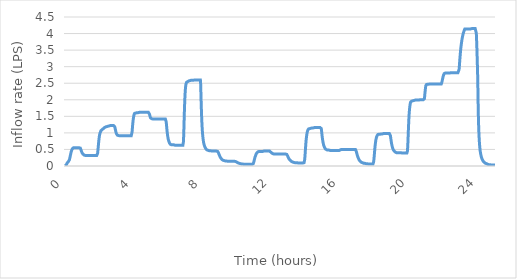
| Category | (LPS)            |
|---|---|
| 0.0 | 0.01 |
| 0.016666666666666666 | 0.01 |
| 0.03333333333333333 | 0.02 |
| 0.05 | 0.03 |
| 0.06666666666666667 | 0.04 |
| 0.08333333333333333 | 0.05 |
| 0.09999999999999999 | 0.07 |
| 0.11666666666666665 | 0.09 |
| 0.13333333333333333 | 0.11 |
| 0.15 | 0.12 |
| 0.16666666666666666 | 0.12 |
| 0.18333333333333332 | 0.13 |
| 0.19999999999999998 | 0.13 |
| 0.21666666666666665 | 0.14 |
| 0.2333333333333333 | 0.16 |
| 0.24999999999999997 | 0.19 |
| 0.26666666666666666 | 0.22 |
| 0.2833333333333333 | 0.27 |
| 0.3 | 0.31 |
| 0.31666666666666665 | 0.35 |
| 0.3333333333333333 | 0.39 |
| 0.35 | 0.43 |
| 0.36666666666666664 | 0.46 |
| 0.3833333333333333 | 0.48 |
| 0.39999999999999997 | 0.5 |
| 0.41666666666666663 | 0.52 |
| 0.4333333333333333 | 0.53 |
| 0.44999999999999996 | 0.54 |
| 0.4666666666666666 | 0.55 |
| 0.4833333333333333 | 0.55 |
| 0.49999999999999994 | 0.55 |
| 0.5166666666666666 | 0.55 |
| 0.5333333333333333 | 0.55 |
| 0.55 | 0.55 |
| 0.5666666666666668 | 0.55 |
| 0.5833333333333335 | 0.55 |
| 0.6000000000000002 | 0.55 |
| 0.6166666666666669 | 0.55 |
| 0.6333333333333336 | 0.55 |
| 0.6500000000000004 | 0.55 |
| 0.6666666666666671 | 0.55 |
| 0.6833333333333338 | 0.55 |
| 0.7000000000000005 | 0.55 |
| 0.7166666666666672 | 0.55 |
| 0.733333333333334 | 0.55 |
| 0.7500000000000007 | 0.55 |
| 0.7666666666666674 | 0.55 |
| 0.7833333333333341 | 0.55 |
| 0.8000000000000008 | 0.55 |
| 0.8166666666666675 | 0.55 |
| 0.8333333333333343 | 0.55 |
| 0.850000000000001 | 0.56 |
| 0.8666666666666677 | 0.55 |
| 0.8833333333333344 | 0.54 |
| 0.9000000000000011 | 0.51 |
| 0.9166666666666679 | 0.49 |
| 0.9333333333333346 | 0.46 |
| 0.9500000000000013 | 0.44 |
| 0.966666666666668 | 0.42 |
| 0.9833333333333347 | 0.4 |
| 1.0000000000000013 | 0.39 |
| 1.016666666666668 | 0.37 |
| 1.0333333333333345 | 0.36 |
| 1.0500000000000012 | 0.35 |
| 1.0666666666666678 | 0.34 |
| 1.0833333333333344 | 0.34 |
| 1.100000000000001 | 0.33 |
| 1.1166666666666676 | 0.33 |
| 1.1333333333333342 | 0.32 |
| 1.1500000000000008 | 0.32 |
| 1.1666666666666674 | 0.32 |
| 1.183333333333334 | 0.32 |
| 1.2000000000000006 | 0.32 |
| 1.2166666666666672 | 0.32 |
| 1.2333333333333338 | 0.32 |
| 1.2500000000000004 | 0.32 |
| 1.266666666666667 | 0.32 |
| 1.2833333333333337 | 0.32 |
| 1.3000000000000003 | 0.32 |
| 1.3166666666666669 | 0.32 |
| 1.3333333333333335 | 0.32 |
| 1.35 | 0.32 |
| 1.3666666666666667 | 0.32 |
| 1.3833333333333333 | 0.32 |
| 1.4 | 0.32 |
| 1.4166666666666665 | 0.32 |
| 1.4333333333333331 | 0.32 |
| 1.4499999999999997 | 0.32 |
| 1.4666666666666663 | 0.32 |
| 1.483333333333333 | 0.32 |
| 1.4999999999999996 | 0.32 |
| 1.5166666666666662 | 0.32 |
| 1.5333333333333328 | 0.32 |
| 1.5499999999999994 | 0.32 |
| 1.566666666666666 | 0.32 |
| 1.5833333333333326 | 0.32 |
| 1.5999999999999992 | 0.32 |
| 1.6166666666666658 | 0.32 |
| 1.6333333333333324 | 0.32 |
| 1.649999999999999 | 0.32 |
| 1.6666666666666656 | 0.32 |
| 1.6833333333333322 | 0.32 |
| 1.6999999999999988 | 0.32 |
| 1.7166666666666655 | 0.32 |
| 1.733333333333332 | 0.32 |
| 1.7499999999999987 | 0.32 |
| 1.7666666666666653 | 0.32 |
| 1.7833333333333319 | 0.32 |
| 1.7999999999999985 | 0.32 |
| 1.816666666666665 | 0.32 |
| 1.8333333333333317 | 0.32 |
| 1.8499999999999983 | 0.32 |
| 1.866666666666665 | 0.34 |
| 1.8833333333333315 | 0.38 |
| 1.8999999999999981 | 0.46 |
| 1.9166666666666647 | 0.55 |
| 1.9333333333333313 | 0.65 |
| 1.949999999999998 | 0.74 |
| 1.9666666666666646 | 0.82 |
| 1.9833333333333312 | 0.89 |
| 1.9999999999999978 | 0.94 |
| 2.0166666666666644 | 0.98 |
| 2.033333333333331 | 1.01 |
| 2.0499999999999976 | 1.03 |
| 2.066666666666664 | 1.05 |
| 2.083333333333331 | 1.07 |
| 2.0999999999999974 | 1.08 |
| 2.116666666666664 | 1.09 |
| 2.1333333333333306 | 1.09 |
| 2.1499999999999972 | 1.1 |
| 2.166666666666664 | 1.11 |
| 2.1833333333333305 | 1.12 |
| 2.199999999999997 | 1.12 |
| 2.2166666666666637 | 1.13 |
| 2.2333333333333303 | 1.14 |
| 2.249999999999997 | 1.14 |
| 2.2666666666666635 | 1.15 |
| 2.28333333333333 | 1.16 |
| 2.2999999999999967 | 1.16 |
| 2.3166666666666633 | 1.17 |
| 2.33333333333333 | 1.17 |
| 2.3499999999999965 | 1.18 |
| 2.366666666666663 | 1.18 |
| 2.3833333333333298 | 1.19 |
| 2.3999999999999964 | 1.19 |
| 2.416666666666663 | 1.19 |
| 2.4333333333333296 | 1.2 |
| 2.449999999999996 | 1.2 |
| 2.466666666666663 | 1.2 |
| 2.4833333333333294 | 1.2 |
| 2.499999999999996 | 1.21 |
| 2.5166666666666626 | 1.21 |
| 2.533333333333329 | 1.21 |
| 2.549999999999996 | 1.21 |
| 2.5666666666666624 | 1.21 |
| 2.583333333333329 | 1.21 |
| 2.5999999999999956 | 1.21 |
| 2.6166666666666623 | 1.22 |
| 2.633333333333329 | 1.22 |
| 2.6499999999999955 | 1.22 |
| 2.666666666666662 | 1.22 |
| 2.6833333333333287 | 1.22 |
| 2.6999999999999953 | 1.22 |
| 2.716666666666662 | 1.22 |
| 2.7333333333333285 | 1.22 |
| 2.749999999999995 | 1.22 |
| 2.7666666666666617 | 1.22 |
| 2.7833333333333283 | 1.22 |
| 2.799999999999995 | 1.22 |
| 2.8166666666666615 | 1.22 |
| 2.833333333333328 | 1.22 |
| 2.8499999999999948 | 1.23 |
| 2.8666666666666614 | 1.22 |
| 2.883333333333328 | 1.18 |
| 2.8999999999999946 | 1.14 |
| 2.916666666666661 | 1.1 |
| 2.933333333333328 | 1.06 |
| 2.9499999999999944 | 1.02 |
| 2.966666666666661 | 0.99 |
| 2.9833333333333276 | 0.97 |
| 2.9999999999999942 | 0.95 |
| 3.016666666666661 | 0.94 |
| 3.0333333333333274 | 0.93 |
| 3.049999999999994 | 0.92 |
| 3.0666666666666607 | 0.92 |
| 3.0833333333333273 | 0.92 |
| 3.099999999999994 | 0.92 |
| 3.1166666666666605 | 0.92 |
| 3.133333333333327 | 0.92 |
| 3.1499999999999937 | 0.91 |
| 3.1666666666666603 | 0.91 |
| 3.183333333333327 | 0.91 |
| 3.1999999999999935 | 0.91 |
| 3.21666666666666 | 0.91 |
| 3.2333333333333267 | 0.91 |
| 3.2499999999999933 | 0.91 |
| 3.26666666666666 | 0.91 |
| 3.2833333333333266 | 0.91 |
| 3.299999999999993 | 0.91 |
| 3.3166666666666598 | 0.91 |
| 3.3333333333333264 | 0.91 |
| 3.349999999999993 | 0.91 |
| 3.3666666666666596 | 0.91 |
| 3.383333333333326 | 0.91 |
| 3.399999999999993 | 0.91 |
| 3.4166666666666594 | 0.91 |
| 3.433333333333326 | 0.91 |
| 3.4499999999999926 | 0.91 |
| 3.4666666666666592 | 0.91 |
| 3.483333333333326 | 0.91 |
| 3.4999999999999925 | 0.91 |
| 3.516666666666659 | 0.91 |
| 3.5333333333333257 | 0.91 |
| 3.5499999999999923 | 0.91 |
| 3.566666666666659 | 0.91 |
| 3.5833333333333255 | 0.91 |
| 3.599999999999992 | 0.91 |
| 3.6166666666666587 | 0.91 |
| 3.6333333333333253 | 0.91 |
| 3.649999999999992 | 0.91 |
| 3.6666666666666585 | 0.91 |
| 3.683333333333325 | 0.91 |
| 3.6999999999999917 | 0.91 |
| 3.7166666666666583 | 0.91 |
| 3.733333333333325 | 0.91 |
| 3.7499999999999916 | 0.91 |
| 3.766666666666658 | 0.91 |
| 3.7833333333333248 | 0.91 |
| 3.7999999999999914 | 0.91 |
| 3.816666666666658 | 0.91 |
| 3.8333333333333246 | 0.91 |
| 3.849999999999991 | 0.9 |
| 3.866666666666658 | 0.94 |
| 3.8833333333333244 | 1.02 |
| 3.899999999999991 | 1.12 |
| 3.9166666666666576 | 1.23 |
| 3.9333333333333242 | 1.32 |
| 3.949999999999991 | 1.4 |
| 3.9666666666666575 | 1.46 |
| 3.983333333333324 | 1.51 |
| 3.9999999999999907 | 1.55 |
| 4.016666666666658 | 1.58 |
| 4.033333333333324 | 1.59 |
| 4.049999999999991 | 1.59 |
| 4.0666666666666575 | 1.6 |
| 4.083333333333324 | 1.6 |
| 4.099999999999991 | 1.6 |
| 4.116666666666657 | 1.6 |
| 4.133333333333324 | 1.6 |
| 4.149999999999991 | 1.61 |
| 4.166666666666657 | 1.61 |
| 4.183333333333324 | 1.61 |
| 4.19999999999999 | 1.61 |
| 4.216666666666657 | 1.61 |
| 4.233333333333324 | 1.61 |
| 4.24999999999999 | 1.61 |
| 4.266666666666657 | 1.61 |
| 4.2833333333333234 | 1.61 |
| 4.29999999999999 | 1.62 |
| 4.316666666666657 | 1.62 |
| 4.333333333333323 | 1.62 |
| 4.34999999999999 | 1.62 |
| 4.3666666666666565 | 1.62 |
| 4.383333333333323 | 1.62 |
| 4.39999999999999 | 1.62 |
| 4.416666666666656 | 1.62 |
| 4.433333333333323 | 1.62 |
| 4.4499999999999895 | 1.62 |
| 4.466666666666656 | 1.62 |
| 4.483333333333323 | 1.62 |
| 4.499999999999989 | 1.62 |
| 4.516666666666656 | 1.62 |
| 4.533333333333323 | 1.62 |
| 4.549999999999989 | 1.62 |
| 4.566666666666656 | 1.62 |
| 4.583333333333322 | 1.62 |
| 4.599999999999989 | 1.62 |
| 4.616666666666656 | 1.62 |
| 4.633333333333322 | 1.62 |
| 4.649999999999989 | 1.62 |
| 4.666666666666655 | 1.62 |
| 4.683333333333322 | 1.62 |
| 4.699999999999989 | 1.62 |
| 4.716666666666655 | 1.62 |
| 4.733333333333322 | 1.62 |
| 4.7499999999999885 | 1.62 |
| 4.766666666666655 | 1.62 |
| 4.783333333333322 | 1.62 |
| 4.799999999999988 | 1.62 |
| 4.816666666666655 | 1.62 |
| 4.8333333333333215 | 1.62 |
| 4.849999999999988 | 1.62 |
| 4.866666666666655 | 1.63 |
| 4.883333333333321 | 1.6 |
| 4.899999999999988 | 1.56 |
| 4.9166666666666545 | 1.52 |
| 4.933333333333321 | 1.49 |
| 4.949999999999988 | 1.46 |
| 4.966666666666654 | 1.44 |
| 4.983333333333321 | 1.43 |
| 4.999999999999988 | 1.43 |
| 5.016666666666654 | 1.43 |
| 5.033333333333321 | 1.43 |
| 5.049999999999987 | 1.43 |
| 5.066666666666654 | 1.42 |
| 5.083333333333321 | 1.42 |
| 5.099999999999987 | 1.42 |
| 5.116666666666654 | 1.42 |
| 5.13333333333332 | 1.42 |
| 5.149999999999987 | 1.42 |
| 5.166666666666654 | 1.42 |
| 5.18333333333332 | 1.42 |
| 5.199999999999987 | 1.42 |
| 5.2166666666666535 | 1.42 |
| 5.23333333333332 | 1.42 |
| 5.249999999999987 | 1.42 |
| 5.266666666666653 | 1.42 |
| 5.28333333333332 | 1.42 |
| 5.2999999999999865 | 1.42 |
| 5.316666666666653 | 1.42 |
| 5.33333333333332 | 1.42 |
| 5.349999999999986 | 1.42 |
| 5.366666666666653 | 1.42 |
| 5.3833333333333195 | 1.42 |
| 5.399999999999986 | 1.42 |
| 5.416666666666653 | 1.42 |
| 5.433333333333319 | 1.42 |
| 5.449999999999986 | 1.42 |
| 5.466666666666653 | 1.42 |
| 5.483333333333319 | 1.42 |
| 5.499999999999986 | 1.42 |
| 5.516666666666652 | 1.42 |
| 5.533333333333319 | 1.42 |
| 5.549999999999986 | 1.42 |
| 5.566666666666652 | 1.42 |
| 5.583333333333319 | 1.42 |
| 5.599999999999985 | 1.42 |
| 5.616666666666652 | 1.42 |
| 5.633333333333319 | 1.42 |
| 5.649999999999985 | 1.42 |
| 5.666666666666652 | 1.42 |
| 5.6833333333333185 | 1.42 |
| 5.699999999999985 | 1.42 |
| 5.716666666666652 | 1.42 |
| 5.733333333333318 | 1.42 |
| 5.749999999999985 | 1.42 |
| 5.7666666666666515 | 1.42 |
| 5.783333333333318 | 1.42 |
| 5.799999999999985 | 1.42 |
| 5.816666666666651 | 1.42 |
| 5.833333333333318 | 1.42 |
| 5.8499999999999845 | 1.39 |
| 5.866666666666651 | 1.33 |
| 5.883333333333318 | 1.24 |
| 5.899999999999984 | 1.14 |
| 5.916666666666651 | 1.05 |
| 5.933333333333318 | 0.98 |
| 5.949999999999984 | 0.91 |
| 5.966666666666651 | 0.86 |
| 5.983333333333317 | 0.81 |
| 5.999999999999984 | 0.78 |
| 6.016666666666651 | 0.75 |
| 6.033333333333317 | 0.72 |
| 6.049999999999984 | 0.7 |
| 6.06666666666665 | 0.69 |
| 6.083333333333317 | 0.67 |
| 6.099999999999984 | 0.66 |
| 6.11666666666665 | 0.66 |
| 6.133333333333317 | 0.65 |
| 6.1499999999999835 | 0.65 |
| 6.16666666666665 | 0.64 |
| 6.183333333333317 | 0.64 |
| 6.199999999999983 | 0.64 |
| 6.21666666666665 | 0.64 |
| 6.2333333333333165 | 0.64 |
| 6.249999999999983 | 0.64 |
| 6.26666666666665 | 0.64 |
| 6.283333333333316 | 0.64 |
| 6.299999999999983 | 0.64 |
| 6.3166666666666496 | 0.63 |
| 6.333333333333316 | 0.63 |
| 6.349999999999983 | 0.63 |
| 6.366666666666649 | 0.63 |
| 6.383333333333316 | 0.63 |
| 6.399999999999983 | 0.63 |
| 6.416666666666649 | 0.63 |
| 6.433333333333316 | 0.63 |
| 6.449999999999982 | 0.63 |
| 6.466666666666649 | 0.63 |
| 6.483333333333316 | 0.63 |
| 6.499999999999982 | 0.63 |
| 6.516666666666649 | 0.63 |
| 6.5333333333333155 | 0.63 |
| 6.549999999999982 | 0.63 |
| 6.566666666666649 | 0.63 |
| 6.583333333333315 | 0.63 |
| 6.599999999999982 | 0.63 |
| 6.6166666666666485 | 0.63 |
| 6.633333333333315 | 0.63 |
| 6.649999999999982 | 0.63 |
| 6.666666666666648 | 0.63 |
| 6.683333333333315 | 0.63 |
| 6.6999999999999815 | 0.63 |
| 6.716666666666648 | 0.63 |
| 6.733333333333315 | 0.63 |
| 6.749999999999981 | 0.63 |
| 6.766666666666648 | 0.63 |
| 6.783333333333315 | 0.63 |
| 6.799999999999981 | 0.63 |
| 6.816666666666648 | 0.63 |
| 6.833333333333314 | 0.63 |
| 6.849999999999981 | 0.63 |
| 6.866666666666648 | 0.73 |
| 6.883333333333314 | 0.95 |
| 6.899999999999981 | 1.26 |
| 6.916666666666647 | 1.57 |
| 6.933333333333314 | 1.84 |
| 6.949999999999981 | 2.06 |
| 6.966666666666647 | 2.23 |
| 6.983333333333314 | 2.35 |
| 6.9999999999999805 | 2.43 |
| 7.016666666666647 | 2.48 |
| 7.033333333333314 | 2.51 |
| 7.04999999999998 | 2.53 |
| 7.066666666666647 | 2.54 |
| 7.0833333333333135 | 2.54 |
| 7.09999999999998 | 2.55 |
| 7.116666666666647 | 2.55 |
| 7.133333333333313 | 2.56 |
| 7.14999999999998 | 2.56 |
| 7.1666666666666465 | 2.57 |
| 7.183333333333313 | 2.57 |
| 7.19999999999998 | 2.58 |
| 7.216666666666646 | 2.58 |
| 7.233333333333313 | 2.58 |
| 7.24999999999998 | 2.58 |
| 7.266666666666646 | 2.58 |
| 7.283333333333313 | 2.59 |
| 7.299999999999979 | 2.59 |
| 7.316666666666646 | 2.59 |
| 7.333333333333313 | 2.59 |
| 7.349999999999979 | 2.59 |
| 7.366666666666646 | 2.59 |
| 7.383333333333312 | 2.59 |
| 7.399999999999979 | 2.59 |
| 7.416666666666646 | 2.59 |
| 7.433333333333312 | 2.59 |
| 7.449999999999979 | 2.59 |
| 7.4666666666666455 | 2.59 |
| 7.483333333333312 | 2.6 |
| 7.499999999999979 | 2.6 |
| 7.516666666666645 | 2.6 |
| 7.533333333333312 | 2.6 |
| 7.5499999999999785 | 2.6 |
| 7.566666666666645 | 2.6 |
| 7.583333333333312 | 2.6 |
| 7.599999999999978 | 2.6 |
| 7.616666666666645 | 2.6 |
| 7.6333333333333115 | 2.6 |
| 7.649999999999978 | 2.6 |
| 7.666666666666645 | 2.6 |
| 7.683333333333311 | 2.6 |
| 7.699999999999978 | 2.6 |
| 7.716666666666645 | 2.6 |
| 7.733333333333311 | 2.6 |
| 7.749999999999978 | 2.6 |
| 7.766666666666644 | 2.6 |
| 7.783333333333311 | 2.6 |
| 7.799999999999978 | 2.6 |
| 7.816666666666644 | 2.6 |
| 7.833333333333311 | 2.6 |
| 7.849999999999977 | 2.6 |
| 7.866666666666644 | 2.47 |
| 7.883333333333311 | 2.14 |
| 7.899999999999977 | 1.83 |
| 7.916666666666644 | 1.57 |
| 7.9333333333333105 | 1.35 |
| 7.949999999999977 | 1.18 |
| 7.966666666666644 | 1.04 |
| 7.98333333333331 | 0.93 |
| 7.999999999999977 | 0.85 |
| 8.016666666666644 | 0.78 |
| 8.033333333333312 | 0.72 |
| 8.04999999999998 | 0.68 |
| 8.066666666666647 | 0.64 |
| 8.083333333333314 | 0.61 |
| 8.099999999999982 | 0.59 |
| 8.11666666666665 | 0.57 |
| 8.133333333333317 | 0.55 |
| 8.149999999999984 | 0.53 |
| 8.166666666666652 | 0.52 |
| 8.18333333333332 | 0.51 |
| 8.199999999999987 | 0.5 |
| 8.216666666666654 | 0.5 |
| 8.233333333333322 | 0.49 |
| 8.24999999999999 | 0.48 |
| 8.266666666666657 | 0.48 |
| 8.283333333333324 | 0.47 |
| 8.299999999999992 | 0.47 |
| 8.31666666666666 | 0.47 |
| 8.333333333333327 | 0.47 |
| 8.349999999999994 | 0.46 |
| 8.366666666666662 | 0.46 |
| 8.38333333333333 | 0.46 |
| 8.399999999999997 | 0.46 |
| 8.416666666666664 | 0.46 |
| 8.433333333333332 | 0.46 |
| 8.45 | 0.46 |
| 8.466666666666667 | 0.46 |
| 8.483333333333334 | 0.46 |
| 8.500000000000002 | 0.46 |
| 8.51666666666667 | 0.45 |
| 8.533333333333337 | 0.45 |
| 8.550000000000004 | 0.45 |
| 8.566666666666672 | 0.45 |
| 8.58333333333334 | 0.45 |
| 8.600000000000007 | 0.45 |
| 8.616666666666674 | 0.45 |
| 8.633333333333342 | 0.45 |
| 8.65000000000001 | 0.45 |
| 8.666666666666677 | 0.45 |
| 8.683333333333344 | 0.45 |
| 8.700000000000012 | 0.45 |
| 8.71666666666668 | 0.45 |
| 8.733333333333347 | 0.45 |
| 8.750000000000014 | 0.45 |
| 8.766666666666682 | 0.45 |
| 8.78333333333335 | 0.45 |
| 8.800000000000017 | 0.45 |
| 8.816666666666684 | 0.45 |
| 8.833333333333352 | 0.45 |
| 8.85000000000002 | 0.44 |
| 8.866666666666687 | 0.43 |
| 8.883333333333354 | 0.42 |
| 8.900000000000022 | 0.4 |
| 8.91666666666669 | 0.37 |
| 8.933333333333357 | 0.35 |
| 8.950000000000024 | 0.33 |
| 8.966666666666692 | 0.31 |
| 8.98333333333336 | 0.29 |
| 9.000000000000027 | 0.27 |
| 9.016666666666694 | 0.25 |
| 9.033333333333362 | 0.24 |
| 9.05000000000003 | 0.23 |
| 9.066666666666697 | 0.22 |
| 9.083333333333364 | 0.21 |
| 9.100000000000032 | 0.2 |
| 9.1166666666667 | 0.19 |
| 9.133333333333367 | 0.19 |
| 9.150000000000034 | 0.18 |
| 9.166666666666702 | 0.18 |
| 9.183333333333369 | 0.17 |
| 9.200000000000037 | 0.17 |
| 9.216666666666704 | 0.16 |
| 9.233333333333372 | 0.16 |
| 9.250000000000039 | 0.16 |
| 9.266666666666707 | 0.16 |
| 9.283333333333374 | 0.16 |
| 9.300000000000042 | 0.15 |
| 9.316666666666709 | 0.15 |
| 9.333333333333377 | 0.15 |
| 9.350000000000044 | 0.15 |
| 9.366666666666712 | 0.15 |
| 9.383333333333379 | 0.15 |
| 9.400000000000047 | 0.15 |
| 9.416666666666714 | 0.15 |
| 9.433333333333382 | 0.14 |
| 9.450000000000049 | 0.14 |
| 9.466666666666717 | 0.14 |
| 9.483333333333384 | 0.14 |
| 9.500000000000052 | 0.14 |
| 9.516666666666719 | 0.14 |
| 9.533333333333387 | 0.14 |
| 9.550000000000054 | 0.14 |
| 9.566666666666721 | 0.14 |
| 9.583333333333389 | 0.14 |
| 9.600000000000056 | 0.14 |
| 9.616666666666724 | 0.14 |
| 9.633333333333391 | 0.14 |
| 9.650000000000059 | 0.14 |
| 9.666666666666726 | 0.14 |
| 9.683333333333394 | 0.14 |
| 9.700000000000061 | 0.14 |
| 9.716666666666729 | 0.14 |
| 9.733333333333396 | 0.14 |
| 9.750000000000064 | 0.14 |
| 9.766666666666731 | 0.14 |
| 9.783333333333399 | 0.14 |
| 9.800000000000066 | 0.14 |
| 9.816666666666734 | 0.14 |
| 9.833333333333401 | 0.14 |
| 9.850000000000069 | 0.14 |
| 9.866666666666736 | 0.14 |
| 9.883333333333404 | 0.14 |
| 9.900000000000071 | 0.13 |
| 9.916666666666739 | 0.13 |
| 9.933333333333406 | 0.12 |
| 9.950000000000074 | 0.12 |
| 9.966666666666741 | 0.11 |
| 9.983333333333409 | 0.11 |
| 10.000000000000076 | 0.11 |
| 10.016666666666744 | 0.1 |
| 10.033333333333411 | 0.1 |
| 10.050000000000079 | 0.09 |
| 10.066666666666746 | 0.09 |
| 10.083333333333414 | 0.09 |
| 10.100000000000081 | 0.08 |
| 10.116666666666749 | 0.08 |
| 10.133333333333416 | 0.08 |
| 10.150000000000084 | 0.07 |
| 10.166666666666751 | 0.07 |
| 10.183333333333419 | 0.07 |
| 10.200000000000086 | 0.07 |
| 10.216666666666754 | 0.07 |
| 10.233333333333421 | 0.06 |
| 10.250000000000089 | 0.06 |
| 10.266666666666756 | 0.06 |
| 10.283333333333424 | 0.06 |
| 10.300000000000091 | 0.06 |
| 10.316666666666759 | 0.06 |
| 10.333333333333426 | 0.06 |
| 10.350000000000094 | 0.06 |
| 10.366666666666761 | 0.05 |
| 10.383333333333429 | 0.05 |
| 10.400000000000096 | 0.05 |
| 10.416666666666764 | 0.05 |
| 10.433333333333431 | 0.05 |
| 10.450000000000099 | 0.05 |
| 10.466666666666766 | 0.05 |
| 10.483333333333434 | 0.05 |
| 10.500000000000101 | 0.05 |
| 10.516666666666769 | 0.05 |
| 10.533333333333436 | 0.05 |
| 10.550000000000104 | 0.05 |
| 10.566666666666771 | 0.05 |
| 10.583333333333439 | 0.05 |
| 10.600000000000106 | 0.05 |
| 10.616666666666774 | 0.05 |
| 10.633333333333441 | 0.05 |
| 10.650000000000109 | 0.05 |
| 10.666666666666776 | 0.05 |
| 10.683333333333444 | 0.05 |
| 10.700000000000111 | 0.05 |
| 10.716666666666779 | 0.05 |
| 10.733333333333446 | 0.05 |
| 10.750000000000114 | 0.05 |
| 10.766666666666781 | 0.05 |
| 10.783333333333449 | 0.05 |
| 10.800000000000116 | 0.05 |
| 10.816666666666784 | 0.05 |
| 10.833333333333451 | 0.05 |
| 10.850000000000119 | 0.05 |
| 10.866666666666786 | 0.05 |
| 10.883333333333454 | 0.05 |
| 10.900000000000121 | 0.06 |
| 10.916666666666789 | 0.07 |
| 10.933333333333456 | 0.09 |
| 10.950000000000124 | 0.12 |
| 10.966666666666791 | 0.15 |
| 10.983333333333459 | 0.19 |
| 11.000000000000126 | 0.22 |
| 11.016666666666794 | 0.26 |
| 11.033333333333461 | 0.29 |
| 11.050000000000129 | 0.31 |
| 11.066666666666796 | 0.34 |
| 11.083333333333464 | 0.36 |
| 11.100000000000131 | 0.37 |
| 11.116666666666799 | 0.39 |
| 11.133333333333466 | 0.4 |
| 11.150000000000134 | 0.41 |
| 11.166666666666801 | 0.41 |
| 11.183333333333469 | 0.42 |
| 11.200000000000136 | 0.43 |
| 11.216666666666804 | 0.43 |
| 11.233333333333471 | 0.43 |
| 11.250000000000139 | 0.44 |
| 11.266666666666806 | 0.44 |
| 11.283333333333474 | 0.44 |
| 11.300000000000141 | 0.44 |
| 11.316666666666809 | 0.44 |
| 11.333333333333476 | 0.44 |
| 11.350000000000144 | 0.44 |
| 11.366666666666811 | 0.44 |
| 11.383333333333479 | 0.44 |
| 11.400000000000146 | 0.44 |
| 11.416666666666814 | 0.44 |
| 11.433333333333481 | 0.44 |
| 11.450000000000149 | 0.44 |
| 11.466666666666816 | 0.44 |
| 11.483333333333483 | 0.44 |
| 11.500000000000151 | 0.44 |
| 11.516666666666818 | 0.45 |
| 11.533333333333486 | 0.45 |
| 11.550000000000153 | 0.45 |
| 11.566666666666821 | 0.45 |
| 11.583333333333488 | 0.45 |
| 11.600000000000156 | 0.45 |
| 11.616666666666823 | 0.45 |
| 11.633333333333491 | 0.45 |
| 11.650000000000158 | 0.45 |
| 11.666666666666826 | 0.45 |
| 11.683333333333493 | 0.45 |
| 11.700000000000161 | 0.45 |
| 11.716666666666828 | 0.45 |
| 11.733333333333496 | 0.45 |
| 11.750000000000163 | 0.45 |
| 11.766666666666831 | 0.45 |
| 11.783333333333498 | 0.45 |
| 11.800000000000166 | 0.45 |
| 11.816666666666833 | 0.45 |
| 11.833333333333501 | 0.45 |
| 11.850000000000168 | 0.45 |
| 11.866666666666836 | 0.45 |
| 11.883333333333503 | 0.45 |
| 11.90000000000017 | 0.44 |
| 11.916666666666838 | 0.43 |
| 11.933333333333506 | 0.42 |
| 11.950000000000173 | 0.41 |
| 11.96666666666684 | 0.4 |
| 11.983333333333508 | 0.4 |
| 12.000000000000176 | 0.39 |
| 12.016666666666843 | 0.38 |
| 12.03333333333351 | 0.38 |
| 12.050000000000178 | 0.37 |
| 12.066666666666846 | 0.37 |
| 12.083333333333513 | 0.36 |
| 12.10000000000018 | 0.36 |
| 12.116666666666848 | 0.36 |
| 12.133333333333516 | 0.36 |
| 12.150000000000183 | 0.36 |
| 12.16666666666685 | 0.36 |
| 12.183333333333518 | 0.36 |
| 12.200000000000186 | 0.36 |
| 12.216666666666853 | 0.36 |
| 12.23333333333352 | 0.36 |
| 12.250000000000188 | 0.36 |
| 12.266666666666856 | 0.36 |
| 12.283333333333523 | 0.36 |
| 12.30000000000019 | 0.36 |
| 12.316666666666858 | 0.36 |
| 12.333333333333526 | 0.36 |
| 12.350000000000193 | 0.36 |
| 12.36666666666686 | 0.36 |
| 12.383333333333528 | 0.36 |
| 12.400000000000196 | 0.36 |
| 12.416666666666863 | 0.36 |
| 12.43333333333353 | 0.36 |
| 12.450000000000198 | 0.36 |
| 12.466666666666866 | 0.36 |
| 12.483333333333533 | 0.36 |
| 12.5000000000002 | 0.36 |
| 12.516666666666868 | 0.36 |
| 12.533333333333536 | 0.36 |
| 12.550000000000203 | 0.36 |
| 12.56666666666687 | 0.36 |
| 12.583333333333538 | 0.36 |
| 12.600000000000206 | 0.36 |
| 12.616666666666873 | 0.36 |
| 12.63333333333354 | 0.36 |
| 12.650000000000208 | 0.36 |
| 12.666666666666876 | 0.36 |
| 12.683333333333543 | 0.36 |
| 12.70000000000021 | 0.36 |
| 12.716666666666878 | 0.36 |
| 12.733333333333546 | 0.36 |
| 12.750000000000213 | 0.36 |
| 12.76666666666688 | 0.36 |
| 12.783333333333548 | 0.36 |
| 12.800000000000216 | 0.36 |
| 12.816666666666883 | 0.36 |
| 12.83333333333355 | 0.36 |
| 12.850000000000218 | 0.35 |
| 12.866666666666886 | 0.35 |
| 12.883333333333553 | 0.33 |
| 12.90000000000022 | 0.32 |
| 12.916666666666888 | 0.3 |
| 12.933333333333556 | 0.28 |
| 12.950000000000223 | 0.26 |
| 12.96666666666689 | 0.24 |
| 12.983333333333558 | 0.23 |
| 13.000000000000226 | 0.21 |
| 13.016666666666893 | 0.2 |
| 13.03333333333356 | 0.19 |
| 13.050000000000228 | 0.18 |
| 13.066666666666896 | 0.17 |
| 13.083333333333563 | 0.16 |
| 13.10000000000023 | 0.15 |
| 13.116666666666898 | 0.15 |
| 13.133333333333566 | 0.14 |
| 13.150000000000233 | 0.14 |
| 13.1666666666669 | 0.13 |
| 13.183333333333568 | 0.13 |
| 13.200000000000236 | 0.12 |
| 13.216666666666903 | 0.12 |
| 13.23333333333357 | 0.12 |
| 13.250000000000238 | 0.11 |
| 13.266666666666906 | 0.11 |
| 13.283333333333573 | 0.11 |
| 13.30000000000024 | 0.11 |
| 13.316666666666908 | 0.11 |
| 13.333333333333576 | 0.1 |
| 13.350000000000243 | 0.1 |
| 13.36666666666691 | 0.1 |
| 13.383333333333578 | 0.1 |
| 13.400000000000245 | 0.1 |
| 13.416666666666913 | 0.1 |
| 13.43333333333358 | 0.1 |
| 13.450000000000248 | 0.1 |
| 13.466666666666915 | 0.1 |
| 13.483333333333583 | 0.1 |
| 13.50000000000025 | 0.09 |
| 13.516666666666918 | 0.09 |
| 13.533333333333585 | 0.09 |
| 13.550000000000253 | 0.09 |
| 13.56666666666692 | 0.09 |
| 13.583333333333588 | 0.09 |
| 13.600000000000255 | 0.09 |
| 13.616666666666923 | 0.09 |
| 13.63333333333359 | 0.09 |
| 13.650000000000258 | 0.09 |
| 13.666666666666925 | 0.09 |
| 13.683333333333593 | 0.09 |
| 13.70000000000026 | 0.09 |
| 13.716666666666928 | 0.09 |
| 13.733333333333595 | 0.09 |
| 13.750000000000263 | 0.09 |
| 13.76666666666693 | 0.09 |
| 13.783333333333598 | 0.09 |
| 13.800000000000265 | 0.09 |
| 13.816666666666933 | 0.09 |
| 13.8333333333336 | 0.09 |
| 13.850000000000268 | 0.09 |
| 13.866666666666935 | 0.1 |
| 13.883333333333603 | 0.13 |
| 13.90000000000027 | 0.18 |
| 13.916666666666938 | 0.27 |
| 13.933333333333605 | 0.39 |
| 13.950000000000273 | 0.52 |
| 13.96666666666694 | 0.65 |
| 13.983333333333608 | 0.76 |
| 14.000000000000275 | 0.84 |
| 14.016666666666943 | 0.91 |
| 14.03333333333361 | 0.97 |
| 14.050000000000278 | 1.02 |
| 14.066666666666945 | 1.05 |
| 14.083333333333613 | 1.08 |
| 14.10000000000028 | 1.1 |
| 14.116666666666948 | 1.11 |
| 14.133333333333615 | 1.12 |
| 14.150000000000283 | 1.13 |
| 14.16666666666695 | 1.13 |
| 14.183333333333618 | 1.13 |
| 14.200000000000285 | 1.13 |
| 14.216666666666953 | 1.14 |
| 14.23333333333362 | 1.14 |
| 14.250000000000288 | 1.14 |
| 14.266666666666955 | 1.14 |
| 14.283333333333623 | 1.14 |
| 14.30000000000029 | 1.15 |
| 14.316666666666958 | 1.15 |
| 14.333333333333625 | 1.15 |
| 14.350000000000293 | 1.15 |
| 14.36666666666696 | 1.15 |
| 14.383333333333628 | 1.15 |
| 14.400000000000295 | 1.15 |
| 14.416666666666963 | 1.15 |
| 14.43333333333363 | 1.16 |
| 14.450000000000298 | 1.16 |
| 14.466666666666965 | 1.16 |
| 14.483333333333633 | 1.16 |
| 14.5000000000003 | 1.16 |
| 14.516666666666968 | 1.16 |
| 14.533333333333635 | 1.16 |
| 14.550000000000303 | 1.16 |
| 14.56666666666697 | 1.16 |
| 14.583333333333638 | 1.16 |
| 14.600000000000305 | 1.16 |
| 14.616666666666973 | 1.16 |
| 14.63333333333364 | 1.16 |
| 14.650000000000308 | 1.16 |
| 14.666666666666975 | 1.16 |
| 14.683333333333643 | 1.16 |
| 14.70000000000031 | 1.16 |
| 14.716666666666978 | 1.16 |
| 14.733333333333645 | 1.16 |
| 14.750000000000313 | 1.16 |
| 14.76666666666698 | 1.16 |
| 14.783333333333648 | 1.16 |
| 14.800000000000315 | 1.16 |
| 14.816666666666983 | 1.16 |
| 14.83333333333365 | 1.16 |
| 14.850000000000318 | 1.17 |
| 14.866666666666985 | 1.13 |
| 14.883333333333653 | 1.06 |
| 14.90000000000032 | 0.98 |
| 14.916666666666988 | 0.9 |
| 14.933333333333655 | 0.83 |
| 14.950000000000323 | 0.77 |
| 14.96666666666699 | 0.72 |
| 14.983333333333658 | 0.68 |
| 15.000000000000325 | 0.64 |
| 15.016666666666993 | 0.61 |
| 15.03333333333366 | 0.59 |
| 15.050000000000328 | 0.57 |
| 15.066666666666995 | 0.55 |
| 15.083333333333663 | 0.53 |
| 15.10000000000033 | 0.52 |
| 15.116666666666998 | 0.51 |
| 15.133333333333665 | 0.51 |
| 15.150000000000333 | 0.5 |
| 15.166666666667 | 0.49 |
| 15.183333333333668 | 0.49 |
| 15.200000000000335 | 0.48 |
| 15.216666666667003 | 0.48 |
| 15.23333333333367 | 0.48 |
| 15.250000000000338 | 0.48 |
| 15.266666666667005 | 0.48 |
| 15.283333333333672 | 0.48 |
| 15.30000000000034 | 0.48 |
| 15.316666666667007 | 0.48 |
| 15.333333333333675 | 0.48 |
| 15.350000000000342 | 0.48 |
| 15.36666666666701 | 0.48 |
| 15.383333333333677 | 0.47 |
| 15.400000000000345 | 0.47 |
| 15.416666666667012 | 0.47 |
| 15.43333333333368 | 0.47 |
| 15.450000000000347 | 0.47 |
| 15.466666666667015 | 0.47 |
| 15.483333333333682 | 0.47 |
| 15.50000000000035 | 0.47 |
| 15.516666666667017 | 0.47 |
| 15.533333333333685 | 0.47 |
| 15.550000000000352 | 0.47 |
| 15.56666666666702 | 0.47 |
| 15.583333333333687 | 0.47 |
| 15.600000000000355 | 0.47 |
| 15.616666666667022 | 0.47 |
| 15.63333333333369 | 0.47 |
| 15.650000000000357 | 0.47 |
| 15.666666666667025 | 0.47 |
| 15.683333333333692 | 0.47 |
| 15.70000000000036 | 0.47 |
| 15.716666666667027 | 0.47 |
| 15.733333333333695 | 0.47 |
| 15.750000000000362 | 0.47 |
| 15.76666666666703 | 0.47 |
| 15.783333333333697 | 0.47 |
| 15.800000000000365 | 0.47 |
| 15.816666666667032 | 0.47 |
| 15.8333333333337 | 0.47 |
| 15.850000000000367 | 0.47 |
| 15.866666666667035 | 0.47 |
| 15.883333333333702 | 0.47 |
| 15.90000000000037 | 0.47 |
| 15.916666666667037 | 0.47 |
| 15.933333333333705 | 0.47 |
| 15.950000000000372 | 0.48 |
| 15.96666666666704 | 0.48 |
| 15.983333333333707 | 0.49 |
| 16.000000000000373 | 0.49 |
| 16.01666666666704 | 0.5 |
| 16.033333333333704 | 0.5 |
| 16.05000000000037 | 0.5 |
| 16.066666666667036 | 0.5 |
| 16.0833333333337 | 0.5 |
| 16.100000000000367 | 0.5 |
| 16.116666666667033 | 0.5 |
| 16.1333333333337 | 0.5 |
| 16.150000000000365 | 0.5 |
| 16.16666666666703 | 0.5 |
| 16.183333333333696 | 0.5 |
| 16.20000000000036 | 0.5 |
| 16.216666666667027 | 0.5 |
| 16.233333333333693 | 0.5 |
| 16.25000000000036 | 0.5 |
| 16.266666666667025 | 0.5 |
| 16.28333333333369 | 0.5 |
| 16.300000000000356 | 0.5 |
| 16.31666666666702 | 0.5 |
| 16.333333333333687 | 0.5 |
| 16.350000000000353 | 0.5 |
| 16.36666666666702 | 0.5 |
| 16.383333333333685 | 0.5 |
| 16.40000000000035 | 0.5 |
| 16.416666666667016 | 0.5 |
| 16.43333333333368 | 0.5 |
| 16.450000000000347 | 0.5 |
| 16.466666666667013 | 0.5 |
| 16.48333333333368 | 0.5 |
| 16.500000000000345 | 0.5 |
| 16.51666666666701 | 0.5 |
| 16.533333333333676 | 0.5 |
| 16.55000000000034 | 0.5 |
| 16.566666666667007 | 0.5 |
| 16.583333333333673 | 0.5 |
| 16.60000000000034 | 0.5 |
| 16.616666666667005 | 0.5 |
| 16.63333333333367 | 0.5 |
| 16.650000000000336 | 0.5 |
| 16.666666666667002 | 0.5 |
| 16.683333333333668 | 0.5 |
| 16.700000000000333 | 0.5 |
| 16.716666666667 | 0.5 |
| 16.733333333333665 | 0.5 |
| 16.75000000000033 | 0.5 |
| 16.766666666666996 | 0.5 |
| 16.783333333333662 | 0.5 |
| 16.800000000000328 | 0.5 |
| 16.816666666666993 | 0.5 |
| 16.83333333333366 | 0.5 |
| 16.850000000000325 | 0.5 |
| 16.86666666666699 | 0.49 |
| 16.883333333333656 | 0.47 |
| 16.900000000000322 | 0.44 |
| 16.916666666666988 | 0.41 |
| 16.933333333333653 | 0.37 |
| 16.95000000000032 | 0.34 |
| 16.966666666666985 | 0.31 |
| 16.98333333333365 | 0.28 |
| 17.000000000000316 | 0.26 |
| 17.016666666666982 | 0.24 |
| 17.033333333333648 | 0.22 |
| 17.050000000000313 | 0.2 |
| 17.06666666666698 | 0.18 |
| 17.083333333333645 | 0.17 |
| 17.10000000000031 | 0.16 |
| 17.116666666666976 | 0.15 |
| 17.133333333333642 | 0.14 |
| 17.150000000000308 | 0.13 |
| 17.166666666666973 | 0.12 |
| 17.18333333333364 | 0.12 |
| 17.200000000000305 | 0.11 |
| 17.21666666666697 | 0.11 |
| 17.233333333333636 | 0.1 |
| 17.250000000000302 | 0.1 |
| 17.266666666666968 | 0.1 |
| 17.283333333333633 | 0.09 |
| 17.3000000000003 | 0.09 |
| 17.316666666666965 | 0.09 |
| 17.33333333333363 | 0.08 |
| 17.350000000000296 | 0.08 |
| 17.366666666666962 | 0.08 |
| 17.383333333333628 | 0.08 |
| 17.400000000000293 | 0.08 |
| 17.41666666666696 | 0.07 |
| 17.433333333333625 | 0.07 |
| 17.45000000000029 | 0.07 |
| 17.466666666666956 | 0.07 |
| 17.483333333333622 | 0.07 |
| 17.500000000000288 | 0.07 |
| 17.516666666666953 | 0.07 |
| 17.53333333333362 | 0.07 |
| 17.550000000000285 | 0.06 |
| 17.56666666666695 | 0.06 |
| 17.583333333333616 | 0.06 |
| 17.600000000000282 | 0.06 |
| 17.616666666666948 | 0.06 |
| 17.633333333333614 | 0.06 |
| 17.65000000000028 | 0.06 |
| 17.666666666666945 | 0.06 |
| 17.68333333333361 | 0.06 |
| 17.700000000000276 | 0.06 |
| 17.716666666666942 | 0.06 |
| 17.733333333333608 | 0.06 |
| 17.750000000000274 | 0.06 |
| 17.76666666666694 | 0.06 |
| 17.783333333333605 | 0.06 |
| 17.80000000000027 | 0.06 |
| 17.816666666666936 | 0.06 |
| 17.833333333333602 | 0.06 |
| 17.850000000000268 | 0.06 |
| 17.866666666666934 | 0.06 |
| 17.8833333333336 | 0.08 |
| 17.900000000000265 | 0.11 |
| 17.91666666666693 | 0.17 |
| 17.933333333333596 | 0.26 |
| 17.950000000000262 | 0.36 |
| 17.966666666666928 | 0.47 |
| 17.983333333333594 | 0.57 |
| 18.00000000000026 | 0.65 |
| 18.016666666666925 | 0.72 |
| 18.03333333333359 | 0.78 |
| 18.050000000000257 | 0.82 |
| 18.066666666666922 | 0.86 |
| 18.083333333333588 | 0.88 |
| 18.100000000000254 | 0.91 |
| 18.11666666666692 | 0.92 |
| 18.133333333333585 | 0.94 |
| 18.15000000000025 | 0.95 |
| 18.166666666666917 | 0.95 |
| 18.183333333333582 | 0.95 |
| 18.200000000000248 | 0.95 |
| 18.216666666666914 | 0.96 |
| 18.23333333333358 | 0.96 |
| 18.250000000000245 | 0.96 |
| 18.26666666666691 | 0.96 |
| 18.283333333333577 | 0.96 |
| 18.300000000000242 | 0.96 |
| 18.316666666666908 | 0.97 |
| 18.333333333333574 | 0.97 |
| 18.35000000000024 | 0.97 |
| 18.366666666666905 | 0.97 |
| 18.38333333333357 | 0.97 |
| 18.400000000000237 | 0.97 |
| 18.416666666666902 | 0.97 |
| 18.433333333333568 | 0.97 |
| 18.450000000000234 | 0.97 |
| 18.4666666666669 | 0.98 |
| 18.483333333333565 | 0.98 |
| 18.50000000000023 | 0.98 |
| 18.516666666666897 | 0.98 |
| 18.533333333333562 | 0.98 |
| 18.550000000000228 | 0.98 |
| 18.566666666666894 | 0.98 |
| 18.58333333333356 | 0.98 |
| 18.600000000000225 | 0.98 |
| 18.61666666666689 | 0.98 |
| 18.633333333333557 | 0.98 |
| 18.650000000000222 | 0.98 |
| 18.666666666666888 | 0.98 |
| 18.683333333333554 | 0.98 |
| 18.70000000000022 | 0.98 |
| 18.716666666666885 | 0.98 |
| 18.73333333333355 | 0.98 |
| 18.750000000000217 | 0.98 |
| 18.766666666666882 | 0.98 |
| 18.783333333333548 | 0.98 |
| 18.800000000000214 | 0.98 |
| 18.81666666666688 | 0.98 |
| 18.833333333333545 | 0.98 |
| 18.85000000000021 | 0.98 |
| 18.866666666666877 | 0.96 |
| 18.883333333333542 | 0.91 |
| 18.900000000000208 | 0.84 |
| 18.916666666666874 | 0.78 |
| 18.93333333333354 | 0.72 |
| 18.950000000000205 | 0.67 |
| 18.96666666666687 | 0.63 |
| 18.983333333333537 | 0.59 |
| 19.000000000000203 | 0.56 |
| 19.01666666666687 | 0.53 |
| 19.033333333333534 | 0.51 |
| 19.0500000000002 | 0.49 |
| 19.066666666666865 | 0.47 |
| 19.08333333333353 | 0.46 |
| 19.100000000000197 | 0.45 |
| 19.116666666666863 | 0.44 |
| 19.13333333333353 | 0.43 |
| 19.150000000000194 | 0.42 |
| 19.16666666666686 | 0.42 |
| 19.183333333333525 | 0.41 |
| 19.20000000000019 | 0.41 |
| 19.216666666666857 | 0.41 |
| 19.233333333333523 | 0.4 |
| 19.25000000000019 | 0.4 |
| 19.266666666666854 | 0.4 |
| 19.28333333333352 | 0.4 |
| 19.300000000000185 | 0.4 |
| 19.31666666666685 | 0.4 |
| 19.333333333333517 | 0.4 |
| 19.350000000000183 | 0.4 |
| 19.36666666666685 | 0.4 |
| 19.383333333333514 | 0.4 |
| 19.40000000000018 | 0.4 |
| 19.416666666666845 | 0.4 |
| 19.43333333333351 | 0.4 |
| 19.450000000000177 | 0.4 |
| 19.466666666666843 | 0.4 |
| 19.48333333333351 | 0.4 |
| 19.500000000000174 | 0.4 |
| 19.51666666666684 | 0.39 |
| 19.533333333333506 | 0.39 |
| 19.55000000000017 | 0.39 |
| 19.566666666666837 | 0.39 |
| 19.583333333333503 | 0.39 |
| 19.60000000000017 | 0.39 |
| 19.616666666666834 | 0.39 |
| 19.6333333333335 | 0.39 |
| 19.650000000000166 | 0.39 |
| 19.66666666666683 | 0.39 |
| 19.683333333333497 | 0.39 |
| 19.700000000000163 | 0.39 |
| 19.71666666666683 | 0.39 |
| 19.733333333333494 | 0.39 |
| 19.75000000000016 | 0.39 |
| 19.766666666666826 | 0.39 |
| 19.78333333333349 | 0.39 |
| 19.800000000000157 | 0.39 |
| 19.816666666666823 | 0.39 |
| 19.83333333333349 | 0.39 |
| 19.850000000000154 | 0.4 |
| 19.86666666666682 | 0.45 |
| 19.883333333333486 | 0.57 |
| 19.90000000000015 | 0.77 |
| 19.916666666666817 | 1 |
| 19.933333333333483 | 1.22 |
| 19.95000000000015 | 1.41 |
| 19.966666666666814 | 1.57 |
| 19.98333333333348 | 1.68 |
| 20.000000000000146 | 1.77 |
| 20.01666666666681 | 1.84 |
| 20.033333333333477 | 1.89 |
| 20.050000000000143 | 1.93 |
| 20.06666666666681 | 1.94 |
| 20.083333333333474 | 1.94 |
| 20.10000000000014 | 1.95 |
| 20.116666666666806 | 1.96 |
| 20.13333333333347 | 1.96 |
| 20.150000000000137 | 1.96 |
| 20.166666666666803 | 1.97 |
| 20.18333333333347 | 1.97 |
| 20.200000000000134 | 1.97 |
| 20.2166666666668 | 1.98 |
| 20.233333333333466 | 1.98 |
| 20.25000000000013 | 1.98 |
| 20.266666666666797 | 1.98 |
| 20.283333333333463 | 1.98 |
| 20.30000000000013 | 1.99 |
| 20.316666666666794 | 1.99 |
| 20.33333333333346 | 1.99 |
| 20.350000000000126 | 1.99 |
| 20.36666666666679 | 1.99 |
| 20.383333333333457 | 1.99 |
| 20.400000000000123 | 1.99 |
| 20.41666666666679 | 1.99 |
| 20.433333333333454 | 1.99 |
| 20.45000000000012 | 1.99 |
| 20.466666666666786 | 1.99 |
| 20.48333333333345 | 1.99 |
| 20.500000000000117 | 1.99 |
| 20.516666666666783 | 1.99 |
| 20.53333333333345 | 2 |
| 20.550000000000114 | 2 |
| 20.56666666666678 | 2 |
| 20.583333333333446 | 2 |
| 20.60000000000011 | 2 |
| 20.616666666666777 | 2 |
| 20.633333333333443 | 2 |
| 20.65000000000011 | 2 |
| 20.666666666666774 | 2 |
| 20.68333333333344 | 2 |
| 20.700000000000106 | 2 |
| 20.71666666666677 | 2 |
| 20.733333333333437 | 2 |
| 20.750000000000103 | 2 |
| 20.76666666666677 | 2 |
| 20.783333333333434 | 2 |
| 20.8000000000001 | 2 |
| 20.816666666666766 | 2 |
| 20.83333333333343 | 2 |
| 20.850000000000097 | 2.03 |
| 20.866666666666763 | 2.1 |
| 20.88333333333343 | 2.2 |
| 20.900000000000095 | 2.28 |
| 20.91666666666676 | 2.36 |
| 20.933333333333426 | 2.42 |
| 20.95000000000009 | 2.45 |
| 20.966666666666757 | 2.46 |
| 20.983333333333423 | 2.46 |
| 21.00000000000009 | 2.46 |
| 21.016666666666755 | 2.46 |
| 21.03333333333342 | 2.47 |
| 21.050000000000086 | 2.47 |
| 21.06666666666675 | 2.47 |
| 21.083333333333417 | 2.47 |
| 21.100000000000083 | 2.47 |
| 21.11666666666675 | 2.47 |
| 21.133333333333415 | 2.47 |
| 21.15000000000008 | 2.47 |
| 21.166666666666746 | 2.48 |
| 21.18333333333341 | 2.48 |
| 21.200000000000077 | 2.48 |
| 21.216666666666743 | 2.48 |
| 21.23333333333341 | 2.48 |
| 21.250000000000075 | 2.48 |
| 21.26666666666674 | 2.48 |
| 21.283333333333406 | 2.48 |
| 21.30000000000007 | 2.48 |
| 21.316666666666737 | 2.48 |
| 21.333333333333403 | 2.48 |
| 21.35000000000007 | 2.48 |
| 21.366666666666735 | 2.48 |
| 21.3833333333334 | 2.48 |
| 21.400000000000066 | 2.48 |
| 21.416666666666732 | 2.48 |
| 21.433333333333398 | 2.48 |
| 21.450000000000063 | 2.48 |
| 21.46666666666673 | 2.48 |
| 21.483333333333395 | 2.48 |
| 21.50000000000006 | 2.48 |
| 21.516666666666726 | 2.48 |
| 21.533333333333392 | 2.48 |
| 21.550000000000058 | 2.48 |
| 21.566666666666723 | 2.48 |
| 21.58333333333339 | 2.48 |
| 21.600000000000055 | 2.48 |
| 21.61666666666672 | 2.48 |
| 21.633333333333386 | 2.48 |
| 21.650000000000052 | 2.48 |
| 21.666666666666718 | 2.48 |
| 21.683333333333383 | 2.48 |
| 21.70000000000005 | 2.48 |
| 21.716666666666715 | 2.48 |
| 21.73333333333338 | 2.48 |
| 21.750000000000046 | 2.48 |
| 21.766666666666712 | 2.48 |
| 21.783333333333378 | 2.48 |
| 21.800000000000043 | 2.48 |
| 21.81666666666671 | 2.48 |
| 21.833333333333375 | 2.48 |
| 21.85000000000004 | 2.5 |
| 21.866666666666706 | 2.53 |
| 21.883333333333372 | 2.57 |
| 21.900000000000038 | 2.61 |
| 21.916666666666703 | 2.65 |
| 21.93333333333337 | 2.69 |
| 21.950000000000035 | 2.72 |
| 21.9666666666667 | 2.75 |
| 21.983333333333366 | 2.77 |
| 22.000000000000032 | 2.79 |
| 22.016666666666698 | 2.81 |
| 22.033333333333363 | 2.81 |
| 22.05000000000003 | 2.81 |
| 22.066666666666695 | 2.81 |
| 22.08333333333336 | 2.81 |
| 22.100000000000026 | 2.81 |
| 22.116666666666692 | 2.81 |
| 22.133333333333358 | 2.81 |
| 22.150000000000023 | 2.81 |
| 22.16666666666669 | 2.81 |
| 22.183333333333355 | 2.81 |
| 22.20000000000002 | 2.81 |
| 22.216666666666686 | 2.81 |
| 22.233333333333352 | 2.81 |
| 22.250000000000018 | 2.81 |
| 22.266666666666683 | 2.81 |
| 22.28333333333335 | 2.81 |
| 22.300000000000015 | 2.81 |
| 22.31666666666668 | 2.81 |
| 22.333333333333346 | 2.81 |
| 22.350000000000012 | 2.81 |
| 22.366666666666678 | 2.81 |
| 22.383333333333344 | 2.81 |
| 22.40000000000001 | 2.82 |
| 22.416666666666675 | 2.82 |
| 22.43333333333334 | 2.82 |
| 22.450000000000006 | 2.82 |
| 22.466666666666672 | 2.82 |
| 22.483333333333338 | 2.82 |
| 22.500000000000004 | 2.82 |
| 22.51666666666667 | 2.82 |
| 22.533333333333335 | 2.82 |
| 22.55 | 2.82 |
| 22.566666666666666 | 2.82 |
| 22.583333333333332 | 2.82 |
| 22.599999999999998 | 2.82 |
| 22.616666666666664 | 2.82 |
| 22.63333333333333 | 2.82 |
| 22.649999999999995 | 2.82 |
| 22.66666666666666 | 2.82 |
| 22.683333333333326 | 2.82 |
| 22.699999999999992 | 2.82 |
| 22.716666666666658 | 2.82 |
| 22.733333333333324 | 2.82 |
| 22.74999999999999 | 2.82 |
| 22.766666666666655 | 2.82 |
| 22.78333333333332 | 2.82 |
| 22.799999999999986 | 2.82 |
| 22.816666666666652 | 2.82 |
| 22.833333333333318 | 2.82 |
| 22.849999999999984 | 2.84 |
| 22.86666666666665 | 2.92 |
| 22.883333333333315 | 3.03 |
| 22.89999999999998 | 3.15 |
| 22.916666666666647 | 3.27 |
| 22.933333333333312 | 3.37 |
| 22.949999999999978 | 3.47 |
| 22.966666666666644 | 3.56 |
| 22.98333333333331 | 3.63 |
| 22.999999999999975 | 3.7 |
| 23.01666666666664 | 3.76 |
| 23.033333333333307 | 3.82 |
| 23.049999999999972 | 3.87 |
| 23.066666666666638 | 3.91 |
| 23.083333333333304 | 3.95 |
| 23.09999999999997 | 3.99 |
| 23.116666666666635 | 4.02 |
| 23.1333333333333 | 4.05 |
| 23.149999999999967 | 4.08 |
| 23.166666666666632 | 4.1 |
| 23.183333333333298 | 4.13 |
| 23.199999999999964 | 4.14 |
| 23.21666666666663 | 4.14 |
| 23.233333333333295 | 4.14 |
| 23.24999999999996 | 4.14 |
| 23.266666666666627 | 4.14 |
| 23.283333333333292 | 4.14 |
| 23.299999999999958 | 4.14 |
| 23.316666666666624 | 4.14 |
| 23.33333333333329 | 4.14 |
| 23.349999999999955 | 4.14 |
| 23.36666666666662 | 4.14 |
| 23.383333333333287 | 4.14 |
| 23.399999999999952 | 4.14 |
| 23.416666666666618 | 4.14 |
| 23.433333333333284 | 4.14 |
| 23.44999999999995 | 4.14 |
| 23.466666666666615 | 4.14 |
| 23.48333333333328 | 4.14 |
| 23.499999999999947 | 4.14 |
| 23.516666666666612 | 4.14 |
| 23.533333333333278 | 4.14 |
| 23.549999999999944 | 4.14 |
| 23.56666666666661 | 4.15 |
| 23.583333333333275 | 4.15 |
| 23.59999999999994 | 4.15 |
| 23.616666666666607 | 4.15 |
| 23.633333333333272 | 4.15 |
| 23.649999999999938 | 4.15 |
| 23.666666666666604 | 4.15 |
| 23.68333333333327 | 4.15 |
| 23.699999999999935 | 4.15 |
| 23.7166666666666 | 4.15 |
| 23.733333333333267 | 4.15 |
| 23.749999999999932 | 4.15 |
| 23.766666666666598 | 4.15 |
| 23.783333333333264 | 4.15 |
| 23.79999999999993 | 4.15 |
| 23.816666666666595 | 4.15 |
| 23.83333333333326 | 4.15 |
| 23.849999999999927 | 4.14 |
| 23.866666666666593 | 4.01 |
| 23.88333333333326 | 3.79 |
| 23.899999999999924 | 3.54 |
| 23.91666666666659 | 3.25 |
| 23.933333333333255 | 2.95 |
| 23.94999999999992 | 2.59 |
| 23.966666666666587 | 2 |
| 23.983333333333253 | 1.55 |
| 23.99999999999992 | 1.23 |
| 24.016666666666584 | 0.99 |
| 24.03333333333325 | 0.81 |
| 24.049999999999915 | 0.67 |
| 24.06666666666658 | 0.57 |
| 24.083333333333247 | 0.48 |
| 24.099999999999913 | 0.42 |
| 24.11666666666658 | 0.37 |
| 24.133333333333244 | 0.33 |
| 24.14999999999991 | 0.29 |
| 24.166666666666575 | 0.26 |
| 24.18333333333324 | 0.23 |
| 24.199999999999907 | 0.21 |
| 24.216666666666573 | 0.19 |
| 24.23333333333324 | 0.17 |
| 24.249999999999904 | 0.16 |
| 24.26666666666657 | 0.14 |
| 24.283333333333236 | 0.13 |
| 24.2999999999999 | 0.12 |
| 24.316666666666567 | 0.11 |
| 24.333333333333233 | 0.11 |
| 24.3499999999999 | 0.1 |
| 24.366666666666564 | 0.09 |
| 24.38333333333323 | 0.09 |
| 24.399999999999896 | 0.08 |
| 24.41666666666656 | 0.08 |
| 24.433333333333227 | 0.07 |
| 24.449999999999893 | 0.07 |
| 24.46666666666656 | 0.07 |
| 24.483333333333224 | 0.06 |
| 24.49999999999989 | 0.06 |
| 24.516666666666556 | 0.06 |
| 24.53333333333322 | 0.05 |
| 24.549999999999887 | 0.05 |
| 24.566666666666553 | 0.05 |
| 24.58333333333322 | 0.05 |
| 24.599999999999884 | 0.04 |
| 24.61666666666655 | 0.04 |
| 24.633333333333216 | 0.04 |
| 24.64999999999988 | 0.04 |
| 24.666666666666547 | 0.04 |
| 24.683333333333213 | 0.04 |
| 24.69999999999988 | 0.03 |
| 24.716666666666544 | 0.03 |
| 24.73333333333321 | 0.03 |
| 24.749999999999876 | 0.03 |
| 24.76666666666654 | 0.03 |
| 24.783333333333207 | 0.03 |
| 24.799999999999873 | 0.03 |
| 24.81666666666654 | 0.03 |
| 24.833333333333204 | 0.03 |
| 24.84999999999987 | 0.03 |
| 24.866666666666536 | 0.03 |
| 24.8833333333332 | 0.03 |
| 24.899999999999867 | 0.03 |
| 24.916666666666533 | 0.03 |
| 24.9333333333332 | 0.03 |
| 24.949999999999864 | 0.03 |
| 24.96666666666653 | 0.03 |
| 24.983333333333196 | 0.03 |
| 24.99999999999986 | 0.03 |